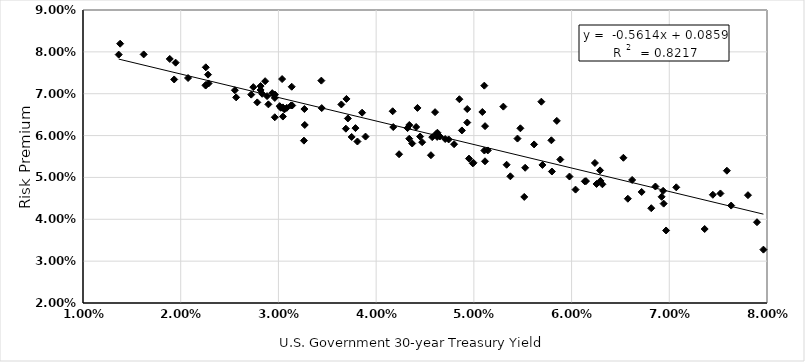
| Category | Series 0 |
|---|---|
| 0.07805079365079366 | 0.046 |
| 0.07897619047619048 | 0.039 |
| 0.07445625 | 0.046 |
| 0.07523593749999999 | 0.046 |
| 0.07071612903225807 | 0.048 |
| 0.06858412698412701 | 0.048 |
| 0.06315468750000001 | 0.048 |
| 0.06135156250000001 | 0.049 |
| 0.06575873015873016 | 0.045 |
| 0.0736225806451613 | 0.038 |
| 0.07589375000000002 | 0.052 |
| 0.07963333333333333 | 0.033 |
| 0.076334375 | 0.043 |
| 0.06942222222222219 | 0.044 |
| 0.06717301587301586 | 0.047 |
| 0.062390476190476205 | 0.053 |
| 0.06291692307692306 | 0.052 |
| 0.06921538461538461 | 0.045 |
| 0.06967272727272728 | 0.037 |
| 0.0662 | 0.049 |
| 0.068153125 | 0.043 |
| 0.06936923076923075 | 0.047 |
| 0.06530454545454545 | 0.055 |
| 0.061478125000000015 | 0.049 |
| 0.05884375 | 0.054 |
| 0.05849076923076921 | 0.064 |
| 0.05476212121212124 | 0.062 |
| 0.051071212121212115 | 0.072 |
| 0.053734374999999994 | 0.05 |
| 0.05798769230769229 | 0.051 |
| 0.06040757575757575 | 0.047 |
| 0.06255909090909091 | 0.048 |
| 0.0629584615384615 | 0.049 |
| 0.0597876923076923 | 0.05 |
| 0.05793230769230769 | 0.059 |
| 0.056907692307692305 | 0.068 |
| 0.054464615384615396 | 0.059 |
| 0.05701692307692307 | 0.053 |
| 0.05525076923076921 | 0.052 |
| 0.05301969696969697 | 0.067 |
| 0.0551578125 | 0.045 |
| 0.05616461538461539 | 0.058 |
| 0.050868181818181826 | 0.066 |
| 0.04932272727272727 | 0.066 |
| 0.04851875 | 0.069 |
| 0.04603230769230768 | 0.066 |
| 0.05113939393939395 | 0.054 |
| 0.05114696969696969 | 0.062 |
| 0.04877692307692307 | 0.061 |
| 0.053353846153846154 | 0.053 |
| 0.05107424242424244 | 0.056 |
| 0.049322727272727296 | 0.063 |
| 0.0470703125 | 0.059 |
| 0.044709230769230765 | 0.058 |
| 0.04422878787878787 | 0.067 |
| 0.046523076923076924 | 0.06 |
| 0.04627076923076921 | 0.061 |
| 0.0514276923076923 | 0.056 |
| 0.04995538461538463 | 0.054 |
| 0.04742307692307691 | 0.059 |
| 0.047975384615384635 | 0.058 |
| 0.049892307692307715 | 0.053 |
| 0.04949999999999998 | 0.055 |
| 0.046140000000000014 | 0.06 |
| 0.04409538461538462 | 0.062 |
| 0.045739999999999996 | 0.06 |
| 0.044501515151515146 | 0.06 |
| 0.036437500000000005 | 0.067 |
| 0.034393749999999994 | 0.073 |
| 0.041692307692307695 | 0.066 |
| 0.04321666666666666 | 0.062 |
| 0.0433921875 | 0.063 |
| 0.046243749999999986 | 0.06 |
| 0.043692307692307676 | 0.058 |
| 0.038563636363636355 | 0.065 |
| 0.04174923076923077 | 0.062 |
| 0.045609374999999994 | 0.055 |
| 0.04338769230769231 | 0.059 |
| 0.03696060606060605 | 0.069 |
| 0.030376190476190473 | 0.074 |
| 0.03136153846153846 | 0.072 |
| 0.029363076923076922 | 0.07 |
| 0.02742923076923078 | 0.072 |
| 0.028639062499999993 | 0.073 |
| 0.03130312500000001 | 0.067 |
| 0.031412307692307684 | 0.067 |
| 0.037107575757575756 | 0.064 |
| 0.03788281250000001 | 0.062 |
| 0.03690312500000001 | 0.062 |
| 0.03443076923076924 | 0.067 |
| 0.03265757575757575 | 0.066 |
| 0.029637499999999997 | 0.07 |
| 0.025540625000000004 | 0.071 |
| 0.028836923076923083 | 0.069 |
| 0.02962424242424244 | 0.064 |
| 0.029630303030303028 | 0.069 |
| 0.02721846153846154 | 0.07 |
| 0.025672307692307696 | 0.069 |
| 0.022793939393939398 | 0.075 |
| 0.028333846153846154 | 0.07 |
| 0.03045230769230771 | 0.067 |
| 0.028972307692307693 | 0.067 |
| 0.028173846153846157 | 0.072 |
| 0.02817384615384615 | 0.071 |
| 0.030235384615384615 | 0.067 |
| 0.030853846153846162 | 0.067 |
| 0.030607692307692315 | 0.066 |
| 0.0326939393939394 | 0.063 |
| 0.0301296875 | 0.067 |
| 0.027836923076923075 | 0.068 |
| 0.022849999999999995 | 0.072 |
| 0.022566666666666676 | 0.076 |
| 0.01887846153846154 | 0.078 |
| 0.013801538461538454 | 0.082 |
| 0.013654545454545457 | 0.079 |
| 0.016210606060606054 | 0.079 |
| 0.020748437499999998 | 0.074 |
| 0.022579999999999996 | 0.072 |
| 0.019333333333333327 | 0.073 |
| 0.019479687499999995 | 0.077 |
| 0.022546031746031748 | 0.072 |
| 0.0304553846153846 | 0.065 |
| 0.03260757575757576 | 0.059 |
| 0.0389125 | 0.06 |
| 0.03749538461538462 | 0.06 |
| 0.03808461538461537 | 0.059 |
| 0.04234461538461539 | 0.056 |